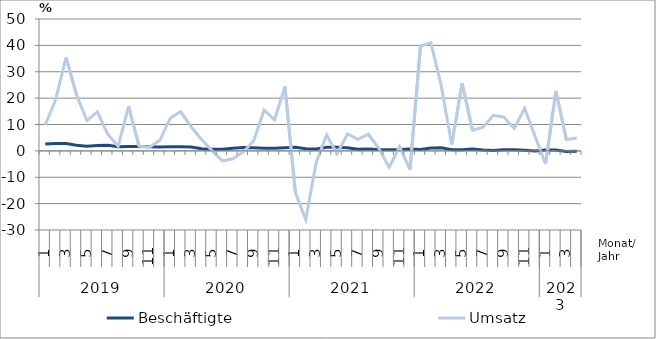
| Category | Beschäftigte | Umsatz |
|---|---|---|
| 0 | 2.6 | 9.8 |
| 1 | 2.8 | 19.4 |
| 2 | 2.8 | 35.4 |
| 3 | 2.1 | 21.3 |
| 4 | 1.8 | 11.5 |
| 5 | 2 | 14.8 |
| 6 | 2.1 | 6.3 |
| 7 | 1.6 | 1.7 |
| 8 | 1.7 | 16.9 |
| 9 | 1.7 | 1.8 |
| 10 | 1.6 | 1.4 |
| 11 | 1.5 | 4 |
| 12 | 1.6 | 12.4 |
| 13 | 1.6 | 14.9 |
| 14 | 1.5 | 9.1 |
| 15 | 0.8 | 4.3 |
| 16 | 0.6 | 0.1 |
| 17 | 0.6 | -3.8 |
| 18 | 1 | -3 |
| 19 | 1.3 | -0.4 |
| 20 | 1.2 | 3.8 |
| 21 | 1 | 15.5 |
| 22 | 1 | 11.7 |
| 23 | 1.2 | 24.4 |
| 24 | 1.4 | -15.8 |
| 25 | 0.8 | -26 |
| 26 | 0.7 | -4.3 |
| 27 | 1.4 | 6 |
| 28 | 1.4 | -1.1 |
| 29 | 1.2 | 6.4 |
| 30 | 0.6 | 4.4 |
| 31 | 0.7 | 6.3 |
| 32 | 0.5 | 1 |
| 33 | 0.4 | -6.2 |
| 34 | 0.5 | 1.6 |
| 35 | 0.7 | -7.1 |
| 36 | 0.5 | 39.7 |
| 37 | 1.1 | 41 |
| 38 | 1.2 | 24.6 |
| 39 | 0.4 | 2.4 |
| 40 | 0.4 | 25.6 |
| 41 | 0.7 | 7.8 |
| 42 | 0.3 | 9 |
| 43 | 0.1 | 13.5 |
| 44 | 0.4 | 12.8 |
| 45 | 0.4 | 8.5 |
| 46 | 0.2 | 16.1 |
| 47 | 0 | 5.5 |
| 48 | 0.3 | -5 |
| 49 | 0.3 | 22.7 |
| 50 | -0.2 | 4.3 |
| 51 | -0.1 | 4.9 |